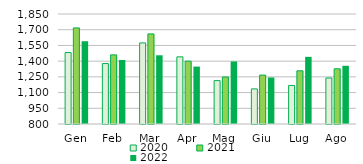
| Category | 2020 | 2021 | 2022 |
|---|---|---|---|
| Gen | 1482 | 1717 | 1590 |
| Feb | 1377 | 1460 | 1411 |
| Mar | 1574 | 1660 | 1456 |
| Apr | 1441 | 1400 | 1348 |
| Mag | 1214 | 1249 | 1397 |
| Giu | 1135 | 1267 | 1244 |
| Lug | 1168 | 1308 | 1441 |
| Ago | 1239 | 1327 | 1355.59 |